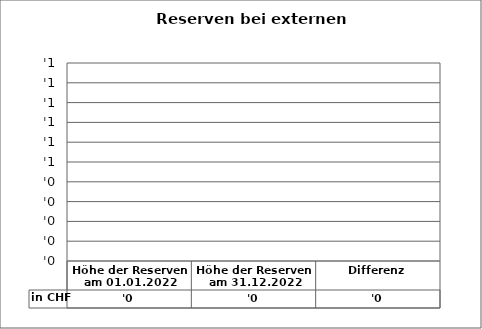
| Category | in CHF |
|---|---|
| Höhe der Reserven am 01.01.2022 | 0 |
| Höhe der Reserven am 31.12.2022 | 0 |
| Differenz | 0 |